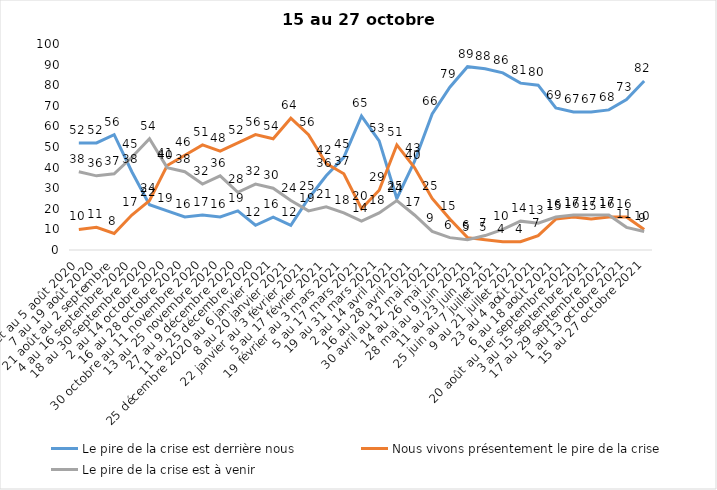
| Category | Le pire de la crise est derrière nous | Nous vivons présentement le pire de la crise | Le pire de la crise est à venir |
|---|---|---|---|
| 24 juillet au 5 août 2020 | 52 | 10 | 38 |
| 7 au 19 août 2020 | 52 | 11 | 36 |
| 21 août au 2 septembre | 56 | 8 | 37 |
| 4 au 16 septembre 2020 | 38 | 17 | 45 |
| 18 au 30 septembre 2020 | 22 | 24 | 54 |
| 2 au 14 octobre 2020 | 19 | 41 | 40 |
| 16 au 28 octobre 2020 | 16 | 46 | 38 |
| 30 octobre au 11 novembre 2020 | 17 | 51 | 32 |
| 13 au 25 novembre 2020 | 16 | 48 | 36 |
| 27 au 9 décembre 2020 | 19 | 52 | 28 |
| 11 au 25 décembre 2020 | 12 | 56 | 32 |
| 25 décembre 2020 au 6 janvier 2021 | 16 | 54 | 30 |
| 8 au 20 janvier 2021 | 12 | 64 | 24 |
| 22 janvier au 3 février 2021 | 25 | 56 | 19 |
| 5 au 17 février 2021 | 36 | 42 | 21 |
| 19 février au 3 mars 2021 | 45 | 37 | 18 |
| 5 au 17 mars 2021 | 65 | 20 | 14 |
| 19 au 31 mars 2021 | 53 | 29 | 18 |
| 2 au 14 avril 2021 | 25 | 51 | 24 |
| 16 au 28 avril 2021 | 43 | 40 | 17 |
| 30 avril au 12 mai 2021 | 66 | 25 | 9 |
| 14 au 26 mai 2021 | 79 | 15 | 6 |
| 28 mai au 9 juin 2021 | 89 | 6 | 5 |
| 11 au 23 juin 2021 | 88 | 5 | 7 |
| 25 juin au 7 juillet 2021 | 86 | 4 | 10 |
| 9 au 21 juillet 2021 | 81 | 4 | 14 |
| 23 au 4 août 2021 | 80 | 7 | 13 |
| 6 au 18 août 2021 | 69 | 15 | 16 |
| 20 août au 1er septembre 2021 | 67 | 16 | 17 |
| 3 au 15 septembre 2021 | 67 | 15 | 17 |
| 17 au 29 septembre 2021 | 68 | 16 | 17 |
| 1 au 13 octobre 2021 | 73 | 16 | 11 |
| 15 au 27 octobre 2021 | 82 | 10 | 9 |